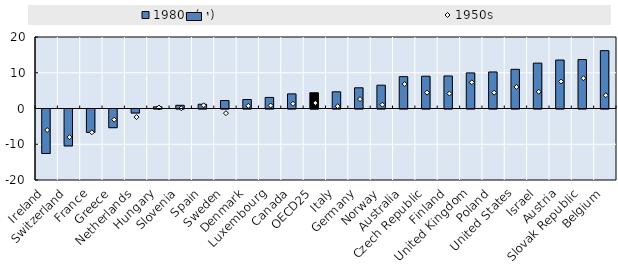
| Category | 1980s (↗) |
|---|---|
| 0 | -12.45 |
| 1 | -10.32 |
| 2 | -6.54 |
| 3 | -5.23 |
| 4 | -1.12 |
| 5 | 0.47 |
| 6 | 0.9 |
| 7 | 1.193 |
| 8 | 2.223 |
| 9 | 2.515 |
| 10 | 3.1 |
| 11 | 4.09 |
| 12 | 4.405 |
| 13 | 4.67 |
| 14 | 5.795 |
| 15 | 6.523 |
| 16 | 8.91 |
| 17 | 9.03 |
| 18 | 9.1 |
| 19 | 9.96 |
| 20 | 10.22 |
| 21 | 10.963 |
| 22 | 12.692 |
| 23 | 13.56 |
| 24 | 13.693 |
| 25 | 16.186 |